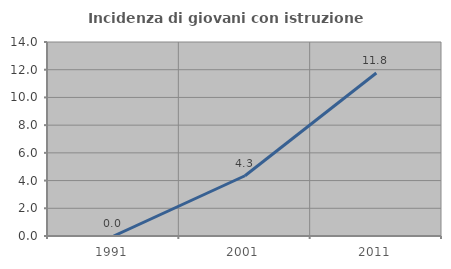
| Category | Incidenza di giovani con istruzione universitaria |
|---|---|
| 1991.0 | 0 |
| 2001.0 | 4.348 |
| 2011.0 | 11.765 |